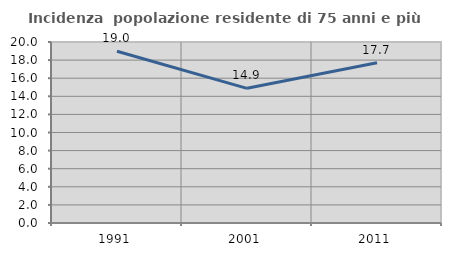
| Category | Incidenza  popolazione residente di 75 anni e più |
|---|---|
| 1991.0 | 18.983 |
| 2001.0 | 14.879 |
| 2011.0 | 17.708 |